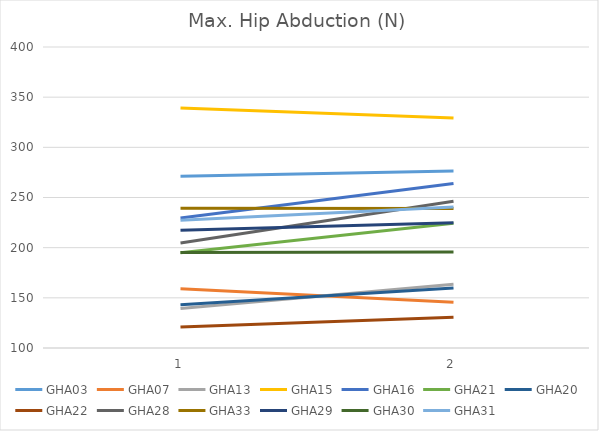
| Category | GHA03 | GHA07 | GHA13 | GHA15 | GHA16 | GHA21 | GHA20 | GHA22 | GHA28 | GHA33 | GHA29 | GHA30 | GHA31 |
|---|---|---|---|---|---|---|---|---|---|---|---|---|---|
| 0 | 271.274 | 159.156 | 139.466 | 339.127 | 229.477 | 194.884 | 143.168 | 120.863 | 204.654 | 239.297 | 217.288 | 195.279 | 227.256 |
| 1 | 276.308 | 145.684 | 163.597 | 329.355 | 263.922 | 224.296 | 159.698 | 130.731 | 246.305 | 239.148 | 224.789 | 195.575 | 240.579 |